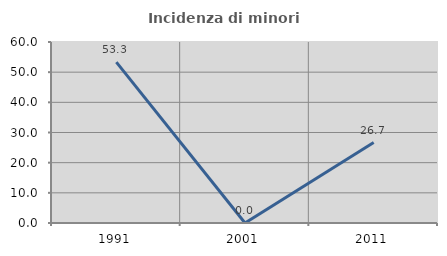
| Category | Incidenza di minori stranieri |
|---|---|
| 1991.0 | 53.333 |
| 2001.0 | 0 |
| 2011.0 | 26.667 |